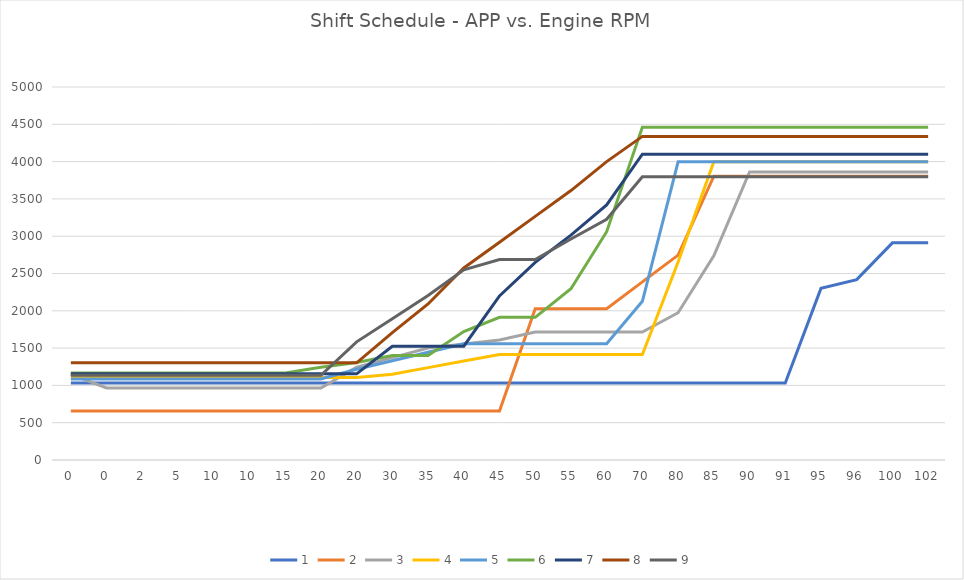
| Category | 1 | 2 | 3 | 4 | 5 | 6 | 7 | 8 | 9 |
|---|---|---|---|---|---|---|---|---|---|
| 0.0 | 1033 | 656 | 1148 | 1105 | 1086 | 1166 | 1155 | 1302 | 1136 |
| 0.0 | 1033 | 656 | 965 | 1105 | 1086 | 1166 | 1155 | 1302 | 1136 |
| 2.0 | 1033 | 656 | 965 | 1105 | 1086 | 1166 | 1155 | 1302 | 1136 |
| 5.0 | 1033 | 656 | 965 | 1105 | 1086 | 1166 | 1155 | 1302 | 1136 |
| 10.0 | 1033 | 656 | 965 | 1105 | 1086 | 1166 | 1155 | 1302 | 1136 |
| 10.0 | 1033 | 656 | 965 | 1105 | 1086 | 1166 | 1155 | 1302 | 1136 |
| 15.0 | 1033 | 656 | 965 | 1105 | 1086 | 1166 | 1155 | 1302 | 1136 |
| 20.0 | 1033 | 656 | 965 | 1105 | 1086 | 1243 | 1155 | 1302 | 1136 |
| 20.0 | 1033 | 656 | 1244 | 1105 | 1216 | 1306 | 1155 | 1302 | 1584 |
| 30.0 | 1033 | 656 | 1373 | 1149 | 1330 | 1402 | 1525 | 1708 | 1894 |
| 35.0 | 1033 | 656 | 1502 | 1238 | 1444 | 1402 | 1525 | 2092 | 2204 |
| 40.0 | 1033 | 656 | 1555 | 1326 | 1558 | 1721 | 1525 | 2574 | 2549 |
| 45.0 | 1033 | 656 | 1609 | 1415 | 1558 | 1912 | 2200 | 2920 | 2687 |
| 50.0 | 1033 | 2029 | 1716 | 1415 | 1558 | 1912 | 2650 | 3266 | 2687 |
| 55.0 | 1033 | 2029 | 1716 | 1415 | 1558 | 2295 | 3015 | 3612 | 2962 |
| 60.0 | 1033 | 2029 | 1716 | 1415 | 1558 | 3060 | 3420 | 4000 | 3227 |
| 70.0 | 1033 | 2388 | 1716 | 1415 | 2128 | 4462 | 4100 | 4338 | 3796 |
| 80.0 | 1033 | 2746 | 1974 | 2653 | 3997 | 4462 | 4100 | 4338 | 3796 |
| 85.0 | 1033 | 3805 | 2736 | 3997 | 3997 | 4462 | 4100 | 4338 | 3796 |
| 90.0 | 1033 | 3805 | 3862 | 3997 | 3997 | 4462 | 4100 | 4338 | 3796 |
| 91.0 | 1033 | 3805 | 3862 | 3997 | 3997 | 4462 | 4100 | 4338 | 3796 |
| 95.0 | 2301 | 3805 | 3862 | 3997 | 3997 | 4462 | 4100 | 4338 | 3796 |
| 96.0 | 2418 | 3805 | 3862 | 3997 | 3997 | 4462 | 4100 | 4338 | 3796 |
| 100.0 | 2911 | 3805 | 3862 | 3997 | 3997 | 4462 | 4100 | 4338 | 3796 |
| 102.0 | 2911 | 3805 | 3862 | 3997 | 3997 | 4462 | 4100 | 4338 | 3796 |